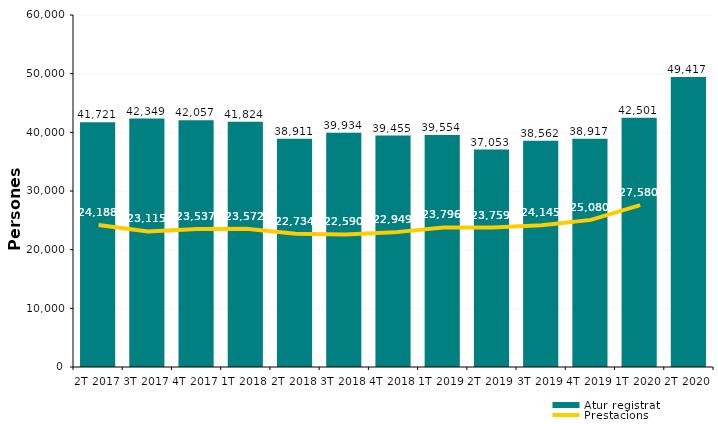
| Category | Atur registrat |
|---|---|
| 2T 2017 | 41721 |
| 3T 2017 | 42349 |
| 4T 2017 | 42057 |
| 1T 2018 | 41824 |
| 2T 2018 | 38911 |
| 3T 2018 | 39934 |
| 4T 2018 | 39455 |
| 1T 2019 | 39554 |
| 2T 2019 | 37053 |
| 3T 2019 | 38562 |
| 4T 2019 | 38917 |
| 1T 2020 | 42501 |
| 2T 2020 | 49417 |